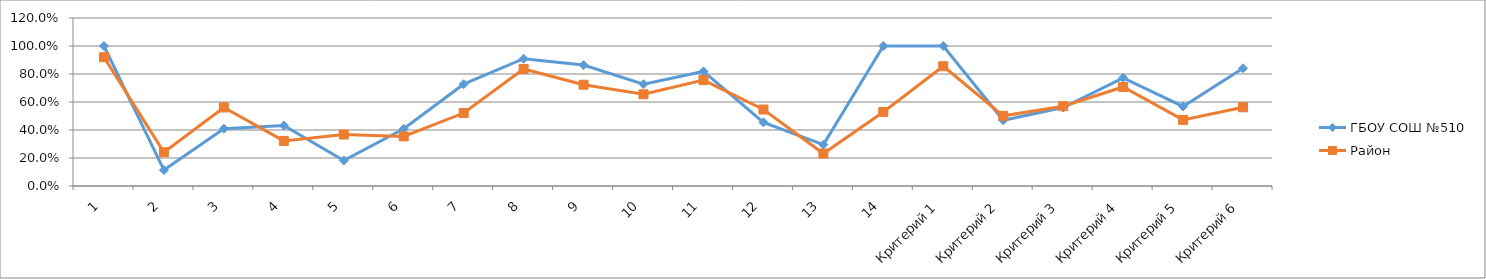
| Category | ГБОУ СОШ №510 | Район |
|---|---|---|
| 1 | 1 | 0.92 |
| 2 | 0.114 | 0.241 |
| 3 | 0.409 | 0.561 |
| 4 | 0.432 | 0.322 |
| 5 | 0.182 | 0.368 |
| 6 | 0.409 | 0.354 |
| 7 | 0.727 | 0.521 |
| 8 | 0.909 | 0.836 |
| 9 | 0.864 | 0.723 |
| 10 | 0.727 | 0.655 |
| 11 | 0.818 | 0.756 |
| 12 | 0.455 | 0.546 |
| 13 | 0.295 | 0.232 |
| 14 | 1 | 0.529 |
| Критерий 1 | 1 | 0.855 |
| Критерий 2 | 0.47 | 0.501 |
| Критерий 3 | 0.561 | 0.57 |
| Критерий 4 | 0.773 | 0.707 |
| Критерий 5 | 0.568 | 0.472 |
| Критерий 6 | 0.841 | 0.562 |